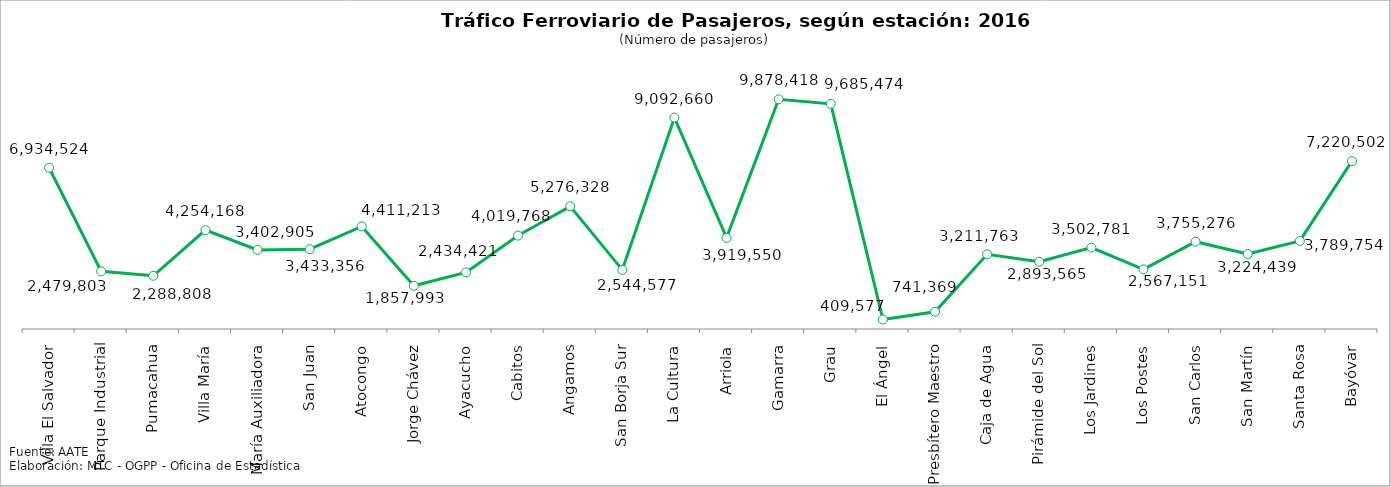
| Category | Series 0 |
|---|---|
| Villa El Salvador | 6934524 |
| Parque Industrial | 2479803 |
| Pumacahua | 2288808 |
| Villa María | 4254168 |
| María Auxiliadora | 3402905 |
| San Juan | 3433356 |
| Atocongo | 4411213 |
| Jorge Chávez | 1857993 |
| Ayacucho | 2434421 |
| Cabitos | 4019768 |
| Angamos | 5276328 |
| San Borja Sur | 2544577 |
| La Cultura | 9092660 |
| Arriola | 3919550 |
| Gamarra | 9878418 |
| Grau | 9685474 |
| El Ángel | 409577 |
| Presbítero Maestro | 741369 |
| Caja de Agua | 3211763 |
| Pirámide del Sol | 2893565 |
| Los Jardines | 3502781 |
| Los Postes | 2567151 |
| San Carlos | 3755276 |
| San Martín | 3224439 |
| Santa Rosa | 3789754 |
| Bayóvar | 7220502 |